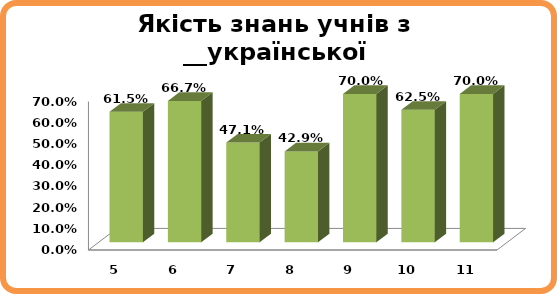
| Category | Series 0 |
|---|---|
| 5.0 | 0.615 |
| 6.0 | 0.667 |
| 7.0 | 0.471 |
| 8.0 | 0.429 |
| 9.0 | 0.7 |
| 10.0 | 0.625 |
| 11.0 | 0.7 |